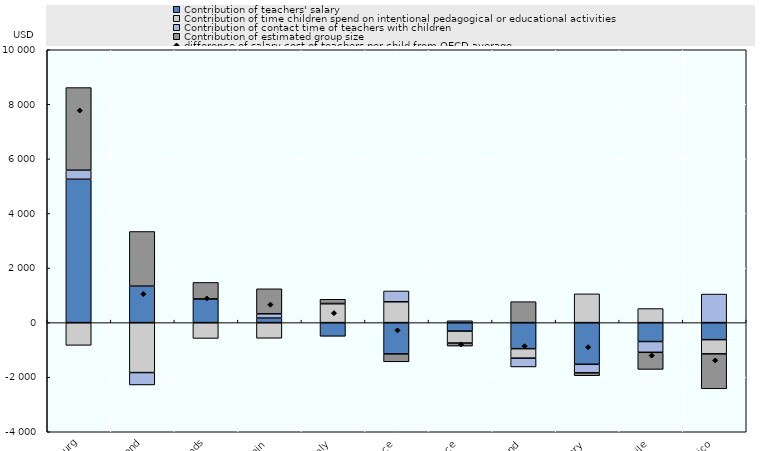
| Category | Contribution of teachers' salary | Contribution of time children spend on intentional pedagogical or educational activities | Contribution of contact time of teachers with children | Contribution of estimated group size |
|---|---|---|---|---|
| Luxembourg | 5254.371 | -832.822 | 332.108 | 3027.928 |
| Switzerland | 1336.715 | -1831.003 | -453.803 | 2003 |
| Netherlands | 868.288 | -579.778 | 1.551 | 603.513 |
| Spain | 166.92 | -573.37 | 155.696 | 916.922 |
| Italy | -500.054 | 697.789 | 1.408 | 156.595 |
| Greece | -1147.861 | 763.79 | 396.269 | -287.891 |
| France | -311.553 | -437.261 | 67.676 | -110.038 |
| Poland | -955.392 | -347.373 | -322.091 | 767.271 |
| Hungary | -1527.092 | 1054.535 | -313.753 | -106.005 |
| Chile | -694.088 | 515.774 | -394.408 | -626.27 |
| Mexico | -624.879 | -520.918 | 1046.474 | -1278.879 |